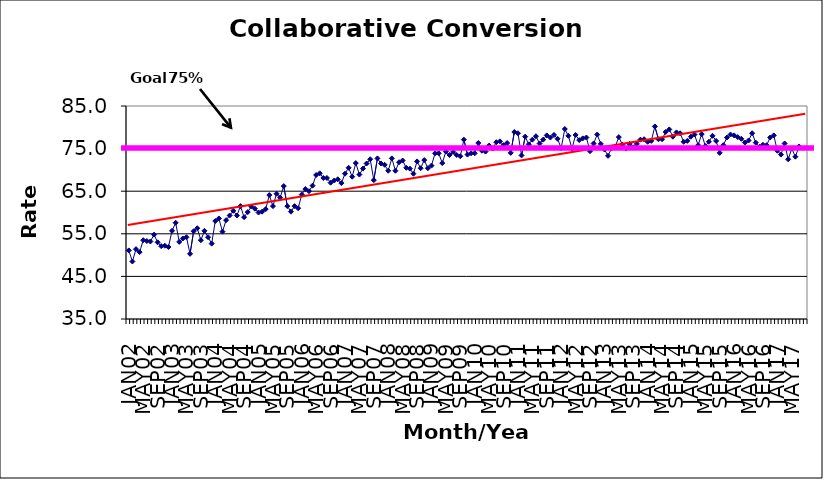
| Category | Series 0 |
|---|---|
| JAN02 | 51.1 |
| FEB02 | 48.5 |
| MAR02 | 51.4 |
| APR02 | 50.7 |
| MAY02 | 53.5 |
| JUN02 | 53.3 |
| JUL02 | 53.2 |
| AUG02 | 54.8 |
| SEP02 | 53 |
| OCT02 | 52.1 |
| NOV02 | 52.2 |
| DEC02 | 51.9 |
| JAN03 | 55.7 |
| FEB03 | 57.6 |
| MAR03 | 53.1 |
| APR03 | 53.9 |
| MAY03 | 54.2 |
| JUN03 | 50.3 |
| JUL03 | 55.6 |
| AUG03 | 56.3 |
| SEP03 | 53.5 |
| OCT03 | 55.7 |
| NOV03 | 54.2 |
| DEC03 | 52.7 |
| JAN04 | 58 |
| FEB04 | 58.6 |
| MAR04 | 55.5 |
| APR04 | 58.2 |
| MAY04 | 59.3 |
| JUN04 | 60.4 |
| JUL04 | 59.3 |
| AUG04 | 61.5 |
| SEP04 | 58.9 |
| OCT04 | 60.1 |
| NOV04 | 61.4 |
| DEC04 | 60.9 |
| JAN05 | 60 |
| FEB05 | 60.2 |
| MAR05 | 60.8 |
| APR05 | 64.1 |
| MAY05 | 61.5 |
| JUN05 | 64.4 |
| JUL05 | 63.5 |
| AUG05 | 66.2 |
| SEP05 | 61.5 |
| OCT05 | 60.2 |
| NOV05 | 61.5 |
| DEC05 | 61 |
| JAN06 | 64.2 |
| FEB06 | 65.5 |
| MAR06 | 65 |
| APR06 | 66.3 |
| MAY06 | 68.8 |
| JUN06 | 69.2 |
| JUL06 | 68.1 |
| AUG06 | 68.1 |
| SEP06 | 67 |
| OCT06 | 67.5 |
| NOV06 | 67.8 |
| DEC06 | 66.9 |
| JAN07 | 69.1 |
| FEB07 | 70.5 |
| MAR07 | 68.4 |
| APR07 | 71.6 |
| MAY07 | 68.9 |
| JUN07 | 70.3 |
| JUL07 | 71.5 |
| AUG07 | 72.5 |
| SEP07 | 67.6 |
| OCT07 | 72.7 |
| NOV07 | 71.5 |
| DEC07 | 71.2 |
| JAN08 | 69.8 |
| FEB08 | 72.7 |
| MAR08 | 69.8 |
| APR08 | 71.8 |
| MAY08 | 72.2 |
| JUN08 | 70.5 |
| JUL08 | 70.3 |
| AUG08 | 69.1 |
| SEP08 | 72 |
| OCT08 | 70.4 |
| NOV08 | 72.3 |
| DEC08 | 70.4 |
| JAN09 | 71 |
| FEB09 | 73.9 |
| MAR09 | 73.9 |
| APR09 | 71.6 |
| MAY09 | 74.3 |
| JUN09 | 73.5 |
| JUL09 | 74.2 |
| AUG09 | 73.5 |
| SEP09 | 73.2 |
| OCT09 | 77.1 |
| NOV09 | 73.6 |
| DEC09 | 73.9 |
| JAN10 | 73.9 |
| FEB10 | 76.3 |
| MAR10 | 74.5 |
| APR10 | 74.3 |
| MAY10 | 75.7 |
| JUN10 | 75 |
| JUL10 | 76.5 |
| AUG10 | 76.7 |
| SEP10 | 75.8 |
| OCT10 | 76.3 |
| NOV10 | 74 |
| DEC10 | 78.9 |
| JAN11 | 78.6 |
| FEB11 | 73.4 |
| MAR11 | 77.8 |
| APR11 | 76 |
| MAY11 | 77.1 |
| JUN11 | 77.9 |
| JUL11 | 76.2 |
| AUG11 | 77.1 |
| SEP11 | 78.1 |
| OCT11 | 77.6 |
| NOV11 | 78.2 |
| DEC11 | 77.3 |
| JAN12 | 75.1 |
| FEB12 | 79.6 |
| MAR12 | 78 |
| APR12 | 75 |
| MAY12 | 78.2 |
| JUN12 | 77 |
| JUL12 | 77.4 |
| AUG12 | 77.6 |
| SEP12 | 74.4 |
| OCT12 | 76.2 |
| NOV12 | 78.3 |
| DEC12 | 76.1 |
| JAN13 | 74.8 |
| FEB13 | 73.3 |
| MAR13 | 75.1 |
| APR13 | 75.5 |
| MAY13 | 77.7 |
| JUN13 | 75.9 |
| JUL13 | 75 |
| AUG13 | 76.1 |
| SEP13 | 75.3 |
| OCT13 | 76.1 |
| NOV13 | 77.1 |
| DEC13 | 77.2 |
| JAN14 | 76.6 |
| FEB14 | 76.8 |
| MAR14 | 80.2 |
| APR14 | 77.2 |
| MAY14 | 77.2 |
| JUN14 | 78.9 |
| JUL14 | 79.5 |
| AUG14 | 77.8 |
| SEP14 | 78.8 |
| OCT14 | 78.6 |
| NOV14 | 76.6 |
| DEC14 | 76.8 |
| JAN15 | 77.8 |
| FEB15 | 78.3 |
| MAR15 | 75.8 |
| APR15 | 78.4 |
| MAY15 | 75.6 |
| JUN15 | 76.6 |
| JUL15 | 78 |
| AUG15 | 76.8 |
| SEP15 | 74 |
| OCT15 | 75.8 |
| NOV15 | 77.6 |
| DEC15 | 78.3 |
| JAN16 | 78.1 |
| FEB16 | 77.7 |
| MAR16 | 77.3 |
| APR16 | 76.4 |
| MAY16 | 76.9 |
| JUN16 | 78.6 |
| JUL16 | 76.4 |
| AUG16 | 75.4 |
| SEP16 | 75.9 |
| OCT16 | 75.8 |
| NOV16 | 77.6 |
| DEC16 | 78.1 |
| JAN17 | 74.5 |
| FEB17 | 73.6 |
| MAR17 | 76.2 |
| APR17 | 72.5 |
| MAY17 | 75 |
| JUN17 | 73.1 |
| JUL17 | 75.5 |